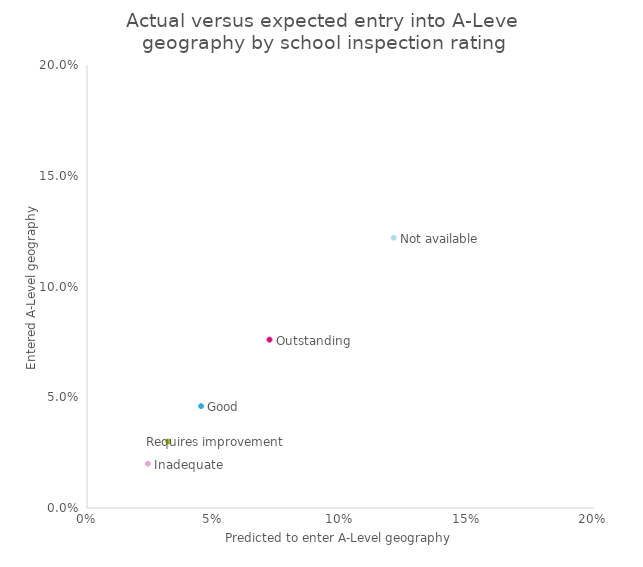
| Category | Series 0 |
|---|---|
| 0.072 | 0.076 |
| 0.045 | 0.046 |
| 0.032 | 0.03 |
| 0.024 | 0.02 |
| 0.121 | 0.122 |